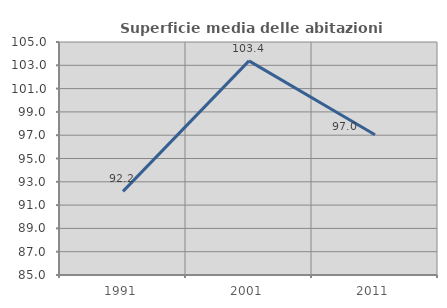
| Category | Superficie media delle abitazioni occupate |
|---|---|
| 1991.0 | 92.176 |
| 2001.0 | 103.378 |
| 2011.0 | 97.042 |